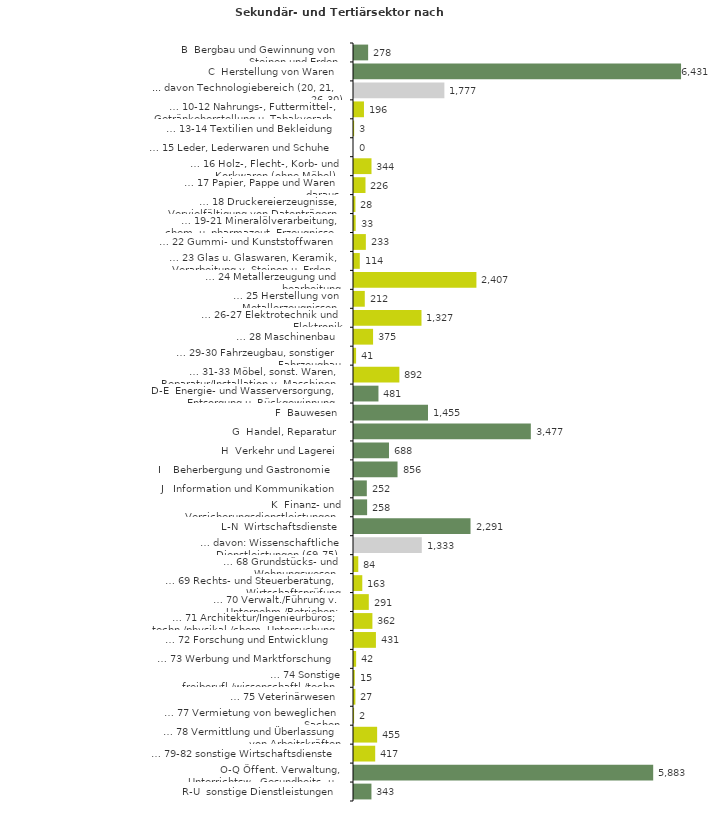
| Category | Series 0 |
|---|---|
| B  Bergbau und Gewinnung von Steinen und Erden | 278 |
| C  Herstellung von Waren | 6431 |
| ... davon Technologiebereich (20, 21, 26-30) | 1777 |
| … 10-12 Nahrungs-, Futtermittel-, Getränkeherstellung u. Tabakverarb. | 196 |
| … 13-14 Textilien und Bekleidung | 3 |
| … 15 Leder, Lederwaren und Schuhe | 0 |
| … 16 Holz-, Flecht-, Korb- und Korkwaren (ohne Möbel)  | 344 |
| … 17 Papier, Pappe und Waren daraus  | 226 |
| … 18 Druckereierzeugnisse, Vervielfältigung von Datenträgern | 28 |
| … 19-21 Mineralölverarbeitung, chem. u. pharmazeut. Erzeugnisse | 33 |
| … 22 Gummi- und Kunststoffwaren | 233 |
| … 23 Glas u. Glaswaren, Keramik, Verarbeitung v. Steinen u. Erden  | 114 |
| … 24 Metallerzeugung und -bearbeitung | 2407 |
| … 25 Herstellung von Metallerzeugnissen  | 212 |
| … 26-27 Elektrotechnik und Elektronik | 1327 |
| … 28 Maschinenbau | 375 |
| … 29-30 Fahrzeugbau, sonstiger Fahrzeugbau | 41 |
| … 31-33 Möbel, sonst. Waren, Reparatur/Installation v. Maschinen | 892 |
| D-E  Energie- und Wasserversorgung, Entsorgung u. Rückgewinnung | 481 |
| F  Bauwesen | 1455 |
| G  Handel, Reparatur | 3477 |
| H  Verkehr und Lagerei | 688 |
| I    Beherbergung und Gastronomie | 856 |
| J   Information und Kommunikation | 252 |
| K  Finanz- und Versicherungsdienstleistungen | 258 |
| L-N  Wirtschaftsdienste | 2291 |
| … davon: Wissenschaftliche Dienstleistungen (69-75) | 1333 |
| … 68 Grundstücks- und Wohnungswesen  | 84 |
| … 69 Rechts- und Steuerberatung, Wirtschaftsprüfung | 163 |
| … 70 Verwalt./Führung v. Unternehm./Betrieben; Unternehmensberat. | 291 |
| … 71 Architektur/Ingenieurbüros; techn./physikal./chem. Untersuchung | 362 |
| … 72 Forschung und Entwicklung  | 431 |
| … 73 Werbung und Marktforschung | 42 |
| … 74 Sonstige freiberufl./wissenschaftl./techn. Tätigkeiten | 15 |
| … 75 Veterinärwesen | 27 |
| … 77 Vermietung von beweglichen Sachen  | 2 |
| … 78 Vermittlung und Überlassung von Arbeitskräften | 455 |
| … 79-82 sonstige Wirtschaftsdienste | 417 |
| O-Q Öffent. Verwaltung, Unterrichtsw., Gesundheits- u. Sozialwesen | 5883 |
| R-U  sonstige Dienstleistungen | 343 |